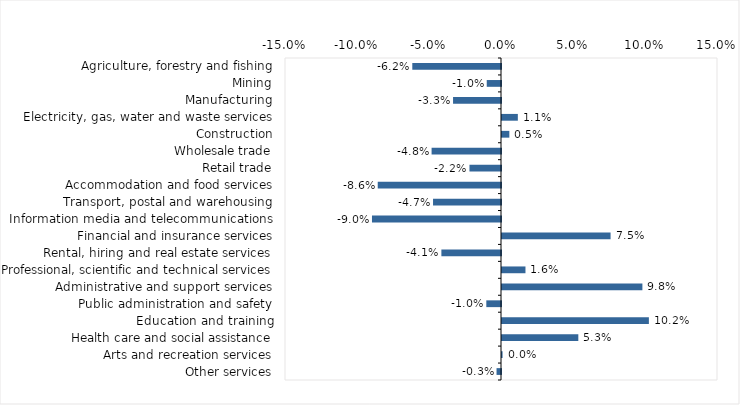
| Category | This week |
|---|---|
| Agriculture, forestry and fishing | -0.062 |
| Mining | -0.01 |
| Manufacturing | -0.033 |
| Electricity, gas, water and waste services | 0.011 |
| Construction | 0.005 |
| Wholesale trade | -0.048 |
| Retail trade | -0.022 |
| Accommodation and food services | -0.086 |
| Transport, postal and warehousing | -0.047 |
| Information media and telecommunications | -0.09 |
| Financial and insurance services | 0.075 |
| Rental, hiring and real estate services | -0.041 |
| Professional, scientific and technical services | 0.016 |
| Administrative and support services | 0.098 |
| Public administration and safety | -0.01 |
| Education and training | 0.102 |
| Health care and social assistance | 0.053 |
| Arts and recreation services | 0 |
| Other services | -0.003 |